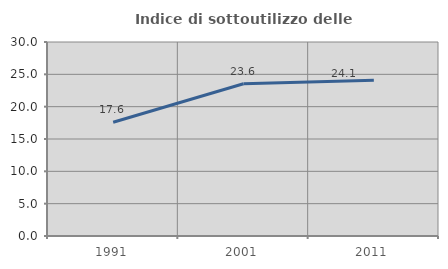
| Category | Indice di sottoutilizzo delle abitazioni  |
|---|---|
| 1991.0 | 17.585 |
| 2001.0 | 23.552 |
| 2011.0 | 24.09 |